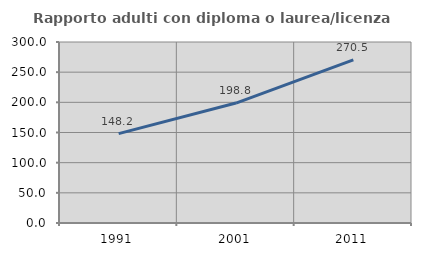
| Category | Rapporto adulti con diploma o laurea/licenza media  |
|---|---|
| 1991.0 | 148.178 |
| 2001.0 | 198.829 |
| 2011.0 | 270.49 |